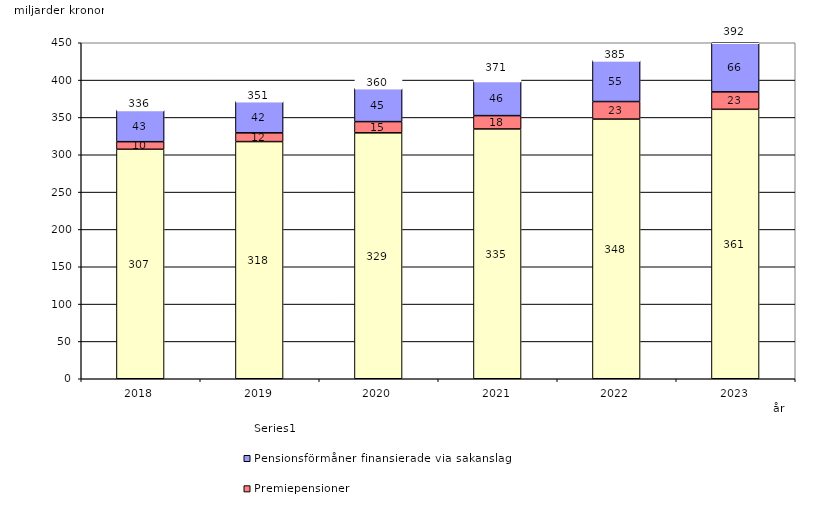
| Category | Inkomstpension och tilläggspension m.m. | Premiepensioner | Pensionsförmåner finansierade via sakanslag | Series 0 |
|---|---|---|---|---|
| 2018.0 | 307.356 | 10.141 | 42.55 | 20 |
| 2019.0 | 317.628 | 11.715 | 42.22 | 20 |
| 2020.0 | 329.365 | 15.016 | 44.546 | 20 |
| 2021.0 | 334.563 | 17.837 | 46.327 | 20 |
| 2022.0 | 347.77 | 23.477 | 55.057 | 20 |
| 2023.0 | 360.859 | 23.388 | 65.805 | 20 |